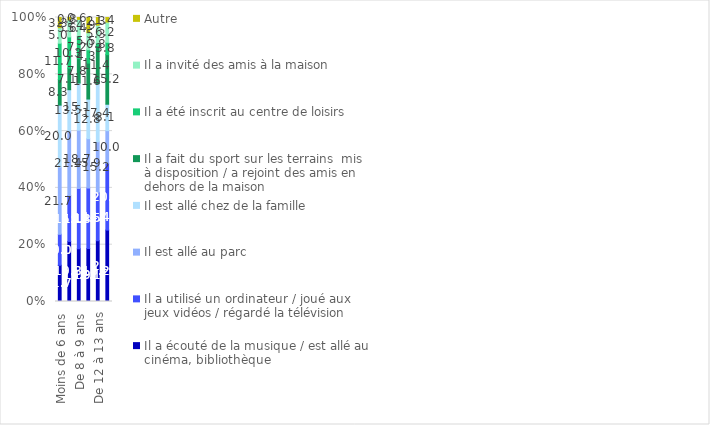
| Category | Il a écouté de la musique / est allé au cinéma, bibliothèque | Il a utilisé un ordinateur / joué aux jeux vidéos / régardé la télévision | Il est allé au parc | Il est allé chez de la famille | Il a fait du sport sur les terrains  mis à disposition / a rejoint des amis en dehors de la maison | Il a été inscrit au centre de loisirs | Il a invité des amis à la maison | Autre |
|---|---|---|---|---|---|---|---|---|
| Moins de 6 ans | 11.7 | 10 | 21.7 | 20 | 8.3 | 11.7 | 5 | 3.3 |
| De 6 à 7 ans | 19.8 | 15.1 | 21.4 | 13.5 | 7.1 | 10.3 | 5.6 | 0.8 |
| De 8 à 9 ans | 16.9 | 19.3 | 18.7 | 15.1 | 7.8 | 7.2 | 5.4 | 0.6 |
| De 10 à 11 ans | 17.1 | 19.5 | 15.9 | 12.8 | 11.6 | 4.3 | 5.5 | 4.9 |
| De 12 à 13 ans | 18.2 | 14.4 | 15.2 | 17.4 | 11.4 | 0.8 | 5.3 | 2.3 |
| De 14 ans à plus | 21.9 | 20.5 | 10 | 8.1 | 15.2 | 3.8 | 6.2 | 1.4 |